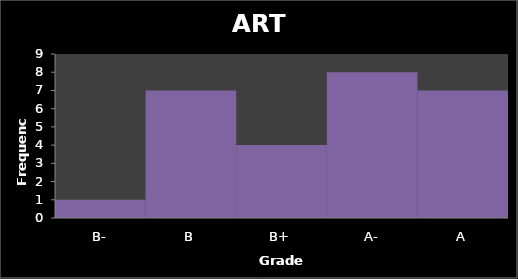
| Category | Series 0 |
|---|---|
| B- | 1 |
| B | 7 |
| B+ | 4 |
| A- | 8 |
| A | 7 |